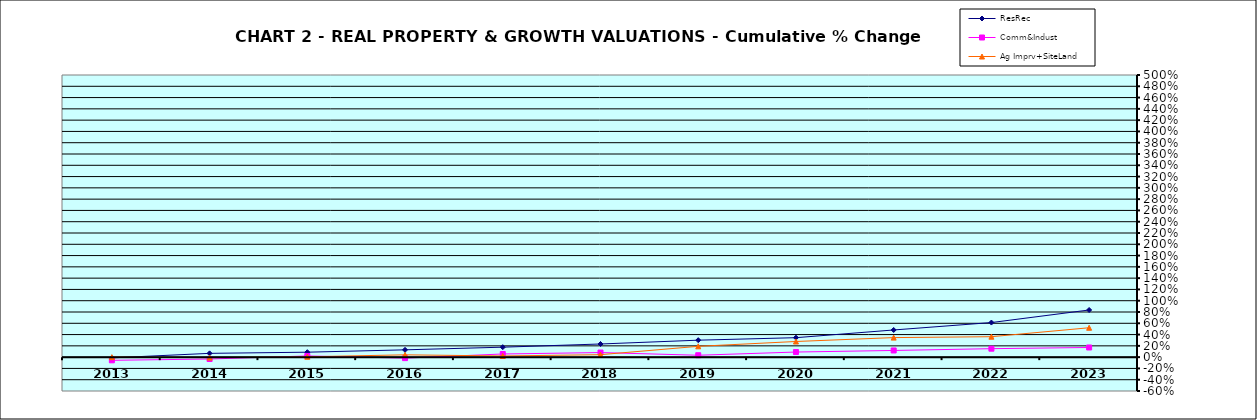
| Category | ResRec | Comm&Indust | Ag Imprv+SiteLand |
|---|---|---|---|
| 2013.0 | -0.013 | -0.056 | 0 |
| 2014.0 | 0.067 | -0.033 | -0.008 |
| 2015.0 | 0.088 | 0.021 | 0.006 |
| 2016.0 | 0.13 | -0.017 | 0.041 |
| 2017.0 | 0.177 | 0.056 | 0.021 |
| 2018.0 | 0.233 | 0.081 | 0.044 |
| 2019.0 | 0.301 | 0.034 | 0.192 |
| 2020.0 | 0.345 | 0.09 | 0.277 |
| 2021.0 | 0.481 | 0.118 | 0.346 |
| 2022.0 | 0.613 | 0.15 | 0.362 |
| 2023.0 | 0.835 | 0.171 | 0.521 |